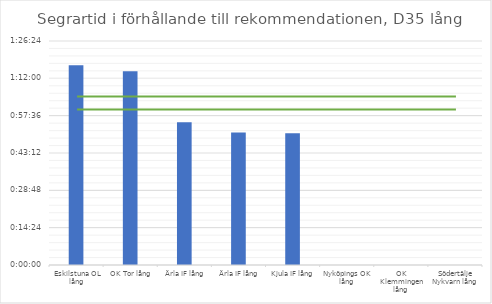
| Category | D35 tid |
|---|---|
| Eskilstuna OL lång | 0.054 |
| OK Tor lång | 0.052 |
| Ärla IF lång | 0.038 |
| Ärla IF lång | 0.035 |
| Kjula IF lång | 0.035 |
| Nyköpings OK lång | 0 |
| OK Klemmingen lång | 0 |
| Södertälje Nykvarn lång | 0 |